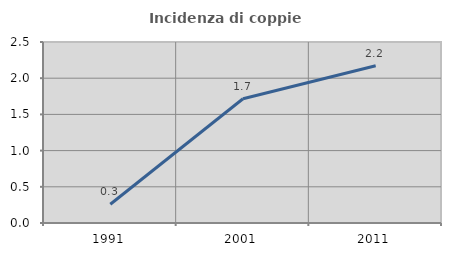
| Category | Incidenza di coppie miste |
|---|---|
| 1991.0 | 0.259 |
| 2001.0 | 1.716 |
| 2011.0 | 2.171 |